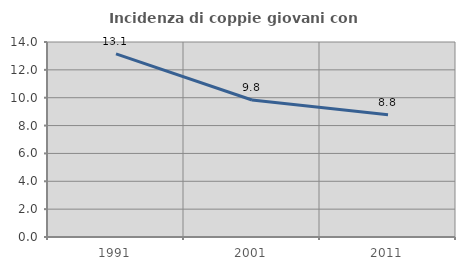
| Category | Incidenza di coppie giovani con figli |
|---|---|
| 1991.0 | 13.144 |
| 2001.0 | 9.833 |
| 2011.0 | 8.772 |